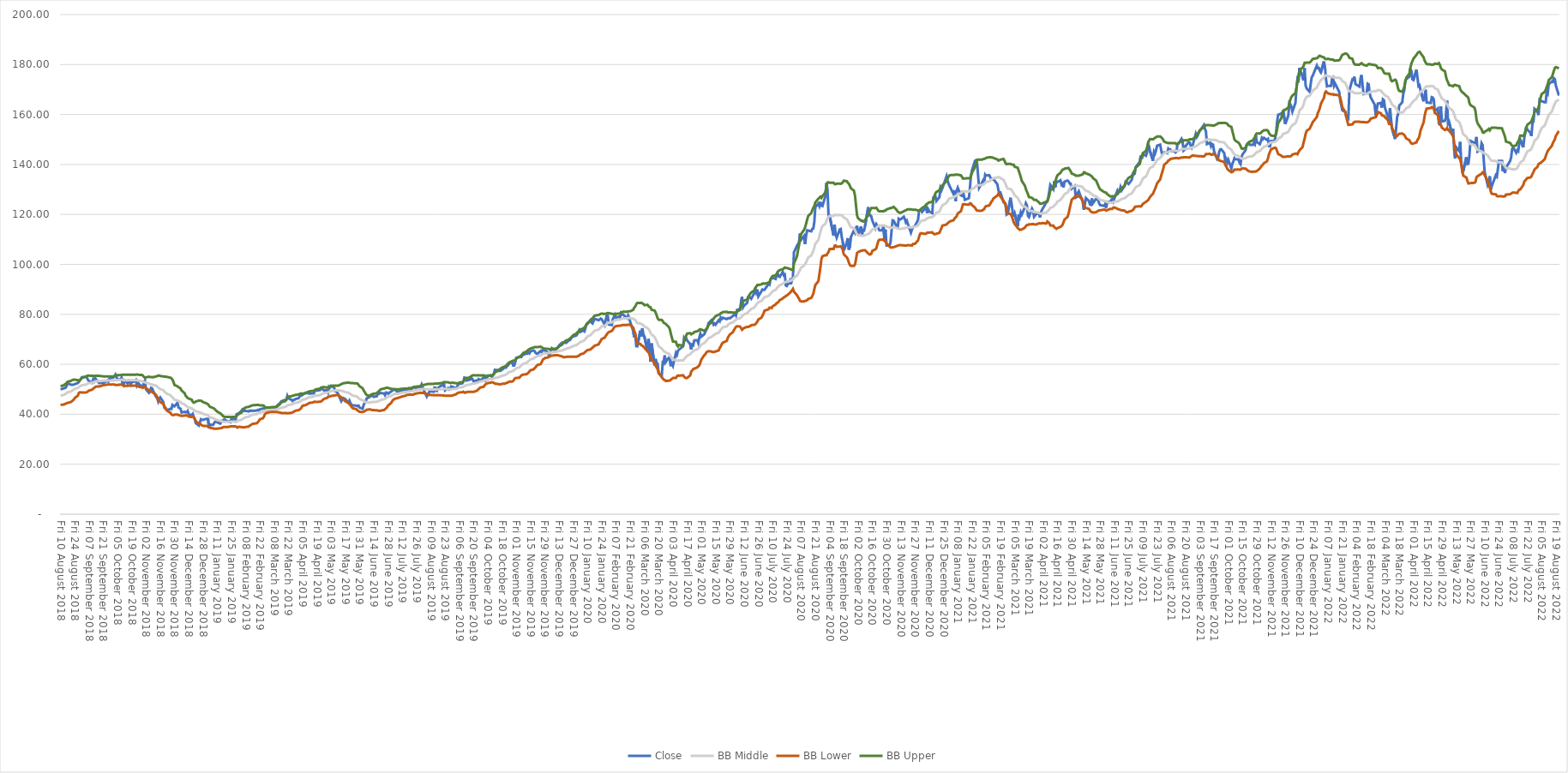
| Category | Close | BB Middle | BB Lower | BB Upper |
|---|---|---|---|---|
| 2022-08-22 | 167.57 | 165.946 | 153.407 | 178.484 |
| 2022-08-19 | 171.52 | 165.204 | 151.443 | 178.965 |
| 2022-08-18 | 174.15 | 164.322 | 150.041 | 178.603 |
| 2022-08-17 | 174.55 | 163.371 | 149.303 | 177.439 |
| 2022-08-16 | 173.03 | 162.285 | 148.486 | 176.084 |
| 2022-08-15 | 173.19 | 161.173 | 147.432 | 174.913 |
| 2022-08-12 | 172.1 | 159.857 | 145.931 | 173.783 |
| 2022-08-11 | 168.49 | 158.75 | 145.385 | 172.115 |
| 2022-08-10 | 169.24 | 157.739 | 144.414 | 171.064 |
| 2022-08-09 | 164.92 | 156.541 | 143.261 | 169.821 |
| 2022-08-08 | 164.87 | 155.578 | 142.076 | 169.08 |
| 2022-08-05 | 165.35 | 154.568 | 140.975 | 168.16 |
| 2022-08-04 | 165.58 | 153.642 | 140.603 | 166.682 |
| 2022-08-03 | 165.9 | 152.67 | 140.464 | 164.876 |
| 2022-08-02 | 159.788 | 151.512 | 140.18 | 162.843 |
| 2022-08-01 | 161.286 | 150.59 | 139.105 | 162.075 |
| 2022-07-29 | 162.285 | 149.463 | 137.972 | 160.954 |
| 2022-07-28 | 157.132 | 148.175 | 136.951 | 159.399 |
| 2022-07-27 | 156.573 | 147.27 | 136.163 | 158.377 |
| 2022-07-26 | 151.39 | 146.304 | 135.24 | 157.368 |
| 2022-07-25 | 152.738 | 145.808 | 134.811 | 156.805 |
| 2022-07-22 | 153.876 | 145.244 | 134.575 | 155.914 |
| 2022-07-21 | 155.135 | 144.454 | 134.124 | 154.784 |
| 2022-07-20 | 152.828 | 143.456 | 133.598 | 153.314 |
| 2022-07-19 | 150.791 | 142.598 | 133.177 | 152.02 |
| 2022-07-18 | 146.866 | 141.628 | 131.792 | 151.464 |
| 2022-07-15 | 149.962 | 140.778 | 130.009 | 151.548 |
| 2022-07-14 | 148.264 | 140.042 | 129.89 | 150.195 |
| 2022-07-13 | 145.288 | 139.258 | 129.346 | 149.17 |
| 2022-07-12 | 145.658 | 138.579 | 128.551 | 148.606 |
| 2022-07-11 | 144.669 | 138.143 | 128.639 | 147.646 |
| 2022-07-08 | 146.836 | 138.031 | 128.788 | 147.275 |
| 2022-07-07 | 146.147 | 138.077 | 128.652 | 147.503 |
| 2022-07-06 | 142.722 | 138.195 | 128.321 | 148.069 |
| 2022-07-05 | 141.364 | 138.356 | 128.095 | 148.617 |
| 2022-07-01 | 138.737 | 138.547 | 127.933 | 149.16 |
| 2022-06-30 | 136.53 | 139.16 | 127.237 | 151.082 |
| 2022-06-29 | 139.037 | 139.758 | 127.237 | 152.28 |
| 2022-06-28 | 137.249 | 140.238 | 127.141 | 153.335 |
| 2022-06-27 | 141.464 | 140.847 | 127.24 | 154.455 |
| 2022-06-24 | 141.464 | 140.953 | 127.295 | 154.611 |
| 2022-06-23 | 138.078 | 140.896 | 127.238 | 154.555 |
| 2022-06-22 | 135.162 | 141.001 | 127.398 | 154.603 |
| 2022-06-21 | 135.682 | 141.388 | 128.034 | 154.742 |
| 2022-06-17 | 131.378 | 141.474 | 128.246 | 154.702 |
| 2022-06-16 | 129.88 | 141.763 | 129.194 | 154.332 |
| 2022-06-15 | 135.242 | 142.3 | 130.95 | 153.651 |
| 2022-06-14 | 132.576 | 142.99 | 131.763 | 154.217 |
| 2022-06-13 | 131.697 | 143.628 | 133.439 | 153.817 |
| 2022-06-10 | 136.94 | 144.388 | 135.717 | 153.06 |
| 2022-06-09 | 142.442 | 144.66 | 136.621 | 152.698 |
| 2022-06-08 | 147.755 | 144.852 | 136.851 | 152.854 |
| 2022-06-07 | 148.504 | 145.179 | 136.249 | 154.109 |
| 2022-06-06 | 145.937 | 145.347 | 136.056 | 154.637 |
| 2022-06-03 | 145.178 | 145.903 | 135.298 | 156.508 |
| 2022-06-02 | 151 | 146.46 | 134.935 | 157.985 |
| 2022-06-01 | 148.504 | 147.187 | 133.065 | 161.31 |
| 2022-05-31 | 148.634 | 147.713 | 132.679 | 162.748 |
| 2022-05-27 | 149.432 | 148.157 | 132.528 | 163.786 |
| 2022-05-26 | 143.581 | 148.546 | 132.431 | 164.66 |
| 2022-05-25 | 140.325 | 149.525 | 132.387 | 166.663 |
| 2022-05-24 | 140.165 | 150.315 | 133.493 | 167.138 |
| 2022-05-23 | 142.911 | 151.125 | 134.783 | 167.467 |
| 2022-05-20 | 137.399 | 152.1 | 135.509 | 168.691 |
| 2022-05-19 | 137.159 | 153.296 | 137.697 | 168.896 |
| 2022-05-18 | 140.625 | 154.736 | 140.073 | 169.398 |
| 2022-05-17 | 149.033 | 156.042 | 141.999 | 170.085 |
| 2022-05-16 | 145.338 | 156.936 | 142.519 | 171.354 |
| 2022-05-13 | 146.906 | 157.899 | 144.152 | 171.647 |
| 2022-05-12 | 142.362 | 158.795 | 145.711 | 171.879 |
| 2022-05-11 | 146.297 | 160.173 | 148.583 | 171.762 |
| 2022-05-10 | 154.296 | 161.217 | 151.153 | 171.28 |
| 2022-05-09 | 151.849 | 161.766 | 152.082 | 171.45 |
| 2022-05-06 | 157.062 | 162.654 | 153.529 | 171.778 |
| 2022-05-05 | 156.323 | 163.383 | 153.841 | 172.925 |
| 2022-05-04 | 165.546 | 164.134 | 154.569 | 173.699 |
| 2022-05-03 | 159.025 | 164.585 | 154.001 | 175.169 |
| 2022-05-02 | 157.509 | 165.53 | 153.787 | 177.273 |
| 2022-04-29 | 157.2 | 166.345 | 154.679 | 178.011 |
| 2022-04-28 | 163.173 | 167.191 | 155.852 | 178.53 |
| 2022-04-27 | 156.123 | 167.895 | 155.91 | 179.88 |
| 2022-04-26 | 156.353 | 169.012 | 157.469 | 180.554 |
| 2022-04-25 | 162.415 | 169.949 | 159.698 | 180.199 |
| 2022-04-22 | 161.329 | 170.539 | 160.742 | 180.336 |
| 2022-04-21 | 165.945 | 171.151 | 162.243 | 180.059 |
| 2022-04-20 | 166.753 | 171.34 | 162.727 | 179.954 |
| 2022-04-19 | 166.923 | 171.42 | 162.948 | 179.891 |
| 2022-04-18 | 164.599 | 171.319 | 162.592 | 180.046 |
| 2022-04-14 | 164.819 | 171.265 | 162.359 | 180.17 |
| 2022-04-13 | 169.914 | 171.032 | 161.263 | 180.801 |
| 2022-04-12 | 167.182 | 170.493 | 159.433 | 181.553 |
| 2022-04-11 | 165.277 | 169.866 | 156.875 | 182.858 |
| 2022-04-08 | 169.605 | 169.112 | 153.629 | 184.595 |
| 2022-04-07 | 171.649 | 168.346 | 151.575 | 185.117 |
| 2022-04-06 | 171.34 | 167.667 | 150.394 | 184.94 |
| 2022-04-05 | 174.561 | 167.224 | 149.896 | 184.552 |
| 2022-04-04 | 177.931 | 166.346 | 148.814 | 183.877 |
| 2022-04-01 | 173.813 | 165.391 | 148.418 | 182.365 |
| 2022-03-31 | 174.112 | 164.836 | 148.279 | 181.393 |
| 2022-03-30 | 177.263 | 164.418 | 148.406 | 180.431 |
| 2022-03-29 | 178.45 | 163.859 | 148.936 | 178.783 |
| 2022-03-28 | 175.099 | 163.074 | 149.735 | 176.412 |
| 2022-03-25 | 174.222 | 162.551 | 150.369 | 174.733 |
| 2022-03-24 | 173.574 | 162.059 | 151.065 | 173.053 |
| 2022-03-23 | 169.725 | 161.494 | 151.847 | 171.142 |
| 2022-03-22 | 168.339 | 160.989 | 152.088 | 169.889 |
| 2022-03-21 | 164.908 | 160.764 | 152.407 | 169.121 |
| 2022-03-18 | 163.512 | 160.86 | 152.274 | 169.446 |
| 2022-03-17 | 160.162 | 161.104 | 151.97 | 170.238 |
| 2022-03-16 | 159.135 | 161.699 | 151.411 | 171.987 |
| 2022-03-15 | 154.648 | 162.357 | 151.165 | 173.549 |
| 2022-03-14 | 150.19 | 163.045 | 152.146 | 173.943 |
| 2022-03-11 | 154.289 | 163.943 | 154.576 | 173.31 |
| 2022-03-10 | 158.068 | 164.81 | 155.984 | 173.636 |
| 2022-03-09 | 162.485 | 165.696 | 156.223 | 175.168 |
| 2022-03-08 | 156.991 | 166.288 | 156.229 | 176.347 |
| 2022-03-07 | 158.846 | 166.997 | 157.688 | 176.305 |
| 2022-03-04 | 162.705 | 167.649 | 158.905 | 176.394 |
| 2022-03-03 | 165.756 | 168.124 | 159.475 | 176.772 |
| 2022-03-02 | 166.085 | 168.592 | 159.505 | 177.678 |
| 2022-03-01 | 162.735 | 168.982 | 159.691 | 178.273 |
| 2022-02-28 | 164.649 | 169.548 | 160.471 | 178.625 |
| 2022-02-25 | 164.38 | 169.797 | 161.003 | 178.591 |
| 2022-02-24 | 162.276 | 169.506 | 159.689 | 179.323 |
| 2022-02-23 | 159.613 | 169.344 | 158.964 | 179.724 |
| 2022-02-22 | 163.851 | 169.319 | 158.845 | 179.794 |
| 2022-02-18 | 166.823 | 169.175 | 158.328 | 180.021 |
| 2022-02-17 | 168.398 | 168.921 | 157.636 | 180.205 |
| 2022-02-16 | 172.058 | 168.692 | 157.192 | 180.192 |
| 2022-02-15 | 172.297 | 168.367 | 156.897 | 179.836 |
| 2022-02-14 | 168.398 | 168.207 | 156.873 | 179.541 |
| 2022-02-11 | 168.159 | 168.405 | 156.927 | 179.882 |
| 2022-02-10 | 171.629 | 168.571 | 157.016 | 180.125 |
| 2022-02-09 | 175.777 | 168.73 | 156.927 | 180.533 |
| 2022-02-08 | 174.331 | 168.659 | 157.01 | 180.307 |
| 2022-02-07 | 171.17 | 168.516 | 157.081 | 179.952 |
| 2022-02-04 | 171.898 | 168.531 | 157.081 | 179.98 |
| 2022-02-03 | 172.187 | 168.5 | 157.083 | 179.917 |
| 2022-02-02 | 175.115 | 168.601 | 157.021 | 180.18 |
| 2022-02-01 | 173.89 | 168.793 | 156.673 | 180.914 |
| 2022-01-31 | 174.06 | 169.162 | 156.037 | 182.286 |
| 2022-01-28 | 169.628 | 169.3 | 155.915 | 182.686 |
| 2022-01-27 | 158.564 | 169.692 | 155.841 | 183.544 |
| 2022-01-26 | 159.032 | 170.696 | 157.314 | 184.078 |
| 2022-01-25 | 159.122 | 171.672 | 159.007 | 184.337 |
| 2022-01-24 | 160.954 | 172.695 | 160.981 | 184.41 |
| 2022-01-21 | 161.741 | 173.425 | 162.977 | 183.873 |
| 2022-01-20 | 163.832 | 174.084 | 165.108 | 183.06 |
| 2022-01-19 | 165.545 | 174.506 | 166.794 | 182.219 |
| 2022-01-18 | 169.1 | 174.682 | 167.664 | 181.7 |
| 2022-01-14 | 172.357 | 174.748 | 167.921 | 181.576 |
| 2022-01-13 | 171.48 | 174.708 | 167.815 | 181.601 |
| 2022-01-12 | 174.807 | 175.062 | 168.142 | 181.983 |
| 2022-01-11 | 174.358 | 175.002 | 168.054 | 181.951 |
| 2022-01-10 | 171.48 | 175.035 | 168.093 | 181.978 |
| 2022-01-07 | 171.46 | 175.397 | 168.479 | 182.314 |
| 2022-01-06 | 171.291 | 175.516 | 168.794 | 182.237 |
| 2022-01-05 | 174.199 | 175.669 | 169.205 | 182.133 |
| 2022-01-04 | 178.959 | 175.483 | 168.656 | 182.31 |
| 2022-01-03 | 181.26 | 174.767 | 166.664 | 182.87 |
| 2021-12-31 | 176.838 | 173.762 | 164.268 | 183.257 |
| 2021-12-30 | 177.466 | 173.075 | 162.626 | 183.523 |
| 2021-12-29 | 178.641 | 172.406 | 161.467 | 183.345 |
| 2021-12-28 | 178.551 | 171.705 | 160.657 | 182.753 |
| 2021-12-27 | 179.587 | 170.756 | 158.988 | 182.524 |
| 2021-12-23 | 175.554 | 169.585 | 156.936 | 182.234 |
| 2021-12-22 | 174.916 | 168.871 | 156.04 | 181.703 |
| 2021-12-21 | 172.277 | 168.163 | 155.18 | 181.145 |
| 2021-12-20 | 169.05 | 167.567 | 154.303 | 180.83 |
| 2021-12-17 | 170.435 | 167.108 | 153.455 | 180.762 |
| 2021-12-16 | 171.55 | 166.448 | 152.234 | 180.661 |
| 2021-12-15 | 178.561 | 165.513 | 150.338 | 180.688 |
| 2021-12-14 | 173.612 | 164.104 | 148.804 | 179.404 |
| 2021-12-13 | 175.016 | 162.892 | 146.971 | 178.814 |
| 2021-12-10 | 178.71 | 161.61 | 145.67 | 177.55 |
| 2021-12-09 | 173.841 | 160.038 | 144.975 | 175.101 |
| 2021-12-08 | 174.358 | 158.711 | 144.078 | 173.345 |
| 2021-12-07 | 170.475 | 157.503 | 144.317 | 170.688 |
| 2021-12-06 | 164.639 | 156.47 | 144.315 | 168.625 |
| 2021-12-03 | 161.173 | 155.771 | 143.972 | 167.569 |
| 2021-12-02 | 163.085 | 155.218 | 143.448 | 166.988 |
| 2021-12-01 | 164.091 | 154.596 | 143.248 | 165.945 |
| 2021-11-30 | 164.619 | 153.851 | 143.155 | 164.547 |
| 2021-11-29 | 159.58 | 153.026 | 143.278 | 162.775 |
| 2021-11-26 | 156.164 | 152.496 | 143.082 | 161.909 |
| 2021-11-24 | 161.273 | 152.274 | 143.008 | 161.539 |
| 2021-11-23 | 160.745 | 151.611 | 143.154 | 160.067 |
| 2021-11-22 | 160.356 | 150.998 | 143.563 | 158.433 |
| 2021-11-19 | 159.888 | 150.371 | 144.189 | 156.553 |
| 2021-11-18 | 157.219 | 149.769 | 145.307 | 154.232 |
| 2021-11-17 | 152.857 | 149.341 | 146.455 | 152.227 |
| 2021-11-16 | 150.378 | 149.119 | 146.705 | 151.533 |
| 2021-11-15 | 149.382 | 148.997 | 146.603 | 151.392 |
| 2021-11-12 | 149.372 | 148.815 | 146.04 | 151.59 |
| 2021-11-11 | 147.261 | 148.548 | 145.094 | 152.001 |
| 2021-11-10 | 147.31 | 148.333 | 144.131 | 152.535 |
| 2021-11-09 | 150.188 | 147.973 | 142.459 | 153.488 |
| 2021-11-08 | 149.82 | 147.5 | 141.251 | 153.749 |
| 2021-11-05 | 150.657 | 147.11 | 140.523 | 153.696 |
| 2021-11-04 | 150.119 | 146.682 | 139.963 | 153.401 |
| 2021-11-03 | 150.646 | 146.301 | 139.54 | 153.062 |
| 2021-11-02 | 149.184 | 145.829 | 139.03 | 152.628 |
| 2021-11-01 | 148.13 | 145.386 | 138.368 | 152.404 |
| 2021-10-29 | 148.965 | 144.898 | 137.371 | 152.425 |
| 2021-10-28 | 151.72 | 144.542 | 137.147 | 151.937 |
| 2021-10-27 | 148.021 | 143.992 | 137.201 | 150.782 |
| 2021-10-26 | 148.488 | 143.692 | 137.114 | 150.27 |
| 2021-10-25 | 147.812 | 143.324 | 137.043 | 149.605 |
| 2021-10-22 | 147.861 | 143.161 | 137.193 | 149.13 |
| 2021-10-21 | 148.647 | 143.073 | 137.337 | 148.81 |
| 2021-10-20 | 148.428 | 142.942 | 137.617 | 148.266 |
| 2021-10-19 | 147.931 | 142.772 | 137.967 | 147.577 |
| 2021-10-18 | 145.733 | 142.507 | 138.325 | 146.689 |
| 2021-10-15 | 144.033 | 142.327 | 138.415 | 146.24 |
| 2021-10-14 | 142.959 | 142.388 | 138.337 | 146.44 |
| 2021-10-13 | 140.125 | 142.638 | 137.915 | 147.362 |
| 2021-10-12 | 140.721 | 143.042 | 137.886 | 148.198 |
| 2021-10-11 | 142.014 | 143.371 | 138.014 | 148.727 |
| 2021-10-08 | 142.104 | 143.706 | 137.91 | 149.501 |
| 2021-10-07 | 142.492 | 144.008 | 137.954 | 150.061 |
| 2021-10-06 | 141.209 | 144.544 | 137.334 | 151.753 |
| 2021-10-05 | 140.324 | 145.195 | 137.018 | 153.373 |
| 2021-10-04 | 138.365 | 145.97 | 136.898 | 155.042 |
| 2021-10-01 | 141.855 | 146.724 | 137.801 | 155.646 |
| 2021-09-30 | 140.712 | 147.271 | 138.268 | 156.273 |
| 2021-09-29 | 142.034 | 147.818 | 139.152 | 156.484 |
| 2021-09-28 | 141.119 | 148.266 | 139.923 | 156.609 |
| 2021-09-27 | 144.56 | 148.823 | 140.99 | 156.656 |
| 2021-09-24 | 146.101 | 148.984 | 141.379 | 156.589 |
| 2021-09-23 | 146.012 | 149.014 | 141.452 | 156.577 |
| 2021-09-22 | 145.037 | 149.091 | 141.62 | 156.561 |
| 2021-09-21 | 142.631 | 149.278 | 142.039 | 156.517 |
| 2021-09-20 | 142.143 | 149.59 | 143.017 | 156.163 |
| 2021-09-17 | 145.246 | 149.851 | 144.121 | 155.581 |
| 2021-09-16 | 147.961 | 149.883 | 144.249 | 155.517 |
| 2021-09-15 | 148.2 | 149.762 | 143.871 | 155.653 |
| 2021-09-14 | 147.295 | 149.82 | 143.969 | 155.671 |
| 2021-09-13 | 148.717 | 149.969 | 144.232 | 155.706 |
| 2021-09-10 | 148.14 | 149.947 | 144.187 | 155.707 |
| 2021-09-09 | 153.211 | 149.943 | 144.178 | 155.708 |
| 2021-09-08 | 154.246 | 149.535 | 143.599 | 155.47 |
| 2021-09-07 | 155.817 | 149.062 | 143.197 | 154.927 |
| 2021-09-03 | 153.44 | 148.535 | 143.336 | 153.733 |
| 2021-09-02 | 152.794 | 148.129 | 143.27 | 152.988 |
| 2021-09-01 | 151.66 | 147.79 | 143.353 | 152.228 |
| 2021-08-31 | 150.984 | 147.503 | 143.371 | 151.635 |
| 2021-08-30 | 152.267 | 147.27 | 143.434 | 151.105 |
| 2021-08-27 | 147.772 | 146.881 | 143.617 | 150.145 |
| 2021-08-26 | 146.718 | 146.734 | 143.38 | 150.088 |
| 2021-08-25 | 147.533 | 146.629 | 143.149 | 150.108 |
| 2021-08-24 | 148.786 | 146.45 | 142.811 | 150.089 |
| 2021-08-23 | 148.876 | 146.297 | 142.81 | 149.784 |
| 2021-08-20 | 147.364 | 146.25 | 142.88 | 149.621 |
| 2021-08-19 | 145.883 | 146.258 | 142.877 | 149.638 |
| 2021-08-18 | 145.544 | 146.252 | 142.868 | 149.636 |
| 2021-08-17 | 149.353 | 146.193 | 142.723 | 149.663 |
| 2021-08-16 | 150.278 | 145.981 | 142.804 | 149.159 |
| 2021-08-13 | 148.269 | 145.54 | 142.419 | 148.661 |
| 2021-08-12 | 148.06 | 145.394 | 142.535 | 148.253 |
| 2021-08-11 | 145.047 | 145.363 | 142.61 | 148.116 |
| 2021-08-10 | 144.789 | 145.515 | 142.522 | 148.509 |
| 2021-08-09 | 145.276 | 145.506 | 142.503 | 148.509 |
| 2021-08-06 | 145.326 | 145.417 | 142.287 | 148.546 |
| 2021-08-05 | 146.022 | 145.354 | 142.171 | 148.538 |
| 2021-08-04 | 145.913 | 145.165 | 141.722 | 148.608 |
| 2021-08-03 | 146.32 | 145.047 | 141.552 | 148.541 |
| 2021-08-02 | 144.493 | 144.782 | 140.928 | 148.635 |
| 2021-07-30 | 144.83 | 144.506 | 139.892 | 149.119 |
| 2021-07-29 | 144.612 | 144.079 | 138.249 | 149.91 |
| 2021-07-28 | 143.956 | 143.648 | 136.846 | 150.45 |
| 2021-07-27 | 145.734 | 143.219 | 135.523 | 150.915 |
| 2021-07-26 | 147.938 | 142.623 | 134.011 | 151.236 |
| 2021-07-23 | 147.511 | 141.835 | 132.46 | 151.211 |
| 2021-07-22 | 145.764 | 141.083 | 131.247 | 150.919 |
| 2021-07-21 | 144.373 | 140.432 | 130.208 | 150.657 |
| 2021-07-20 | 145.118 | 139.866 | 129.326 | 150.405 |
| 2021-07-19 | 141.444 | 139.178 | 128.309 | 150.047 |
| 2021-07-16 | 145.356 | 138.583 | 126.995 | 150.17 |
| 2021-07-15 | 147.432 | 137.858 | 126.242 | 149.473 |
| 2021-07-14 | 148.097 | 136.948 | 125.627 | 148.268 |
| 2021-07-13 | 144.612 | 135.979 | 125.346 | 146.612 |
| 2021-07-12 | 143.48 | 135.227 | 125.022 | 145.431 |
| 2021-07-09 | 144.086 | 134.375 | 124.225 | 144.525 |
| 2021-07-08 | 142.229 | 133.432 | 123.564 | 143.299 |
| 2021-07-07 | 143.549 | 132.632 | 123.161 | 142.103 |
| 2021-07-06 | 141.017 | 131.747 | 123.265 | 140.228 |
| 2021-07-02 | 138.972 | 130.946 | 123.12 | 138.773 |
| 2021-07-01 | 136.301 | 130.248 | 122.934 | 137.562 |
| 2021-06-30 | 135.993 | 129.566 | 122.096 | 137.036 |
| 2021-06-29 | 135.367 | 128.975 | 121.768 | 136.183 |
| 2021-06-28 | 133.828 | 128.377 | 121.409 | 135.346 |
| 2021-06-25 | 132.17 | 127.872 | 121.096 | 134.648 |
| 2021-06-24 | 132.468 | 127.484 | 120.848 | 134.119 |
| 2021-06-23 | 132.756 | 127.158 | 120.904 | 133.412 |
| 2021-06-22 | 133.034 | 126.82 | 121.106 | 132.534 |
| 2021-06-21 | 131.366 | 126.479 | 121.525 | 131.432 |
| 2021-06-18 | 129.539 | 126.138 | 121.661 | 130.615 |
| 2021-06-17 | 130.86 | 125.981 | 121.78 | 130.182 |
| 2021-06-16 | 129.231 | 125.629 | 121.977 | 129.28 |
| 2021-06-15 | 128.725 | 125.366 | 122.047 | 128.684 |
| 2021-06-14 | 129.559 | 125.198 | 122.258 | 128.138 |
| 2021-06-11 | 126.451 | 125.048 | 122.786 | 127.31 |
| 2021-06-10 | 125.22 | 124.93 | 122.727 | 127.132 |
| 2021-06-09 | 126.232 | 124.764 | 122.204 | 127.324 |
| 2021-06-08 | 125.845 | 124.703 | 122.229 | 127.178 |
| 2021-06-07 | 125.011 | 124.709 | 122.224 | 127.194 |
| 2021-06-04 | 125.001 | 124.923 | 121.733 | 128.112 |
| 2021-06-03 | 122.668 | 125.103 | 121.532 | 128.674 |
| 2021-06-02 | 124.177 | 125.319 | 121.842 | 128.795 |
| 2021-06-01 | 123.403 | 125.446 | 121.959 | 128.933 |
| 2021-05-28 | 123.73 | 125.845 | 121.634 | 130.056 |
| 2021-05-27 | 124.396 | 126.174 | 121.658 | 130.69 |
| 2021-05-26 | 125.954 | 126.57 | 121.406 | 131.734 |
| 2021-05-25 | 126.004 | 126.893 | 121.148 | 132.638 |
| 2021-05-24 | 126.203 | 127.254 | 120.904 | 133.603 |
| 2021-05-21 | 124.544 | 127.621 | 120.731 | 134.51 |
| 2021-05-20 | 126.411 | 128.051 | 120.913 | 135.188 |
| 2021-05-19 | 123.81 | 128.269 | 121.079 | 135.46 |
| 2021-05-18 | 123.969 | 128.696 | 121.603 | 135.788 |
| 2021-05-17 | 125.379 | 129.094 | 122.216 | 135.973 |
| 2021-05-14 | 126.55 | 129.509 | 122.578 | 136.439 |
| 2021-05-13 | 124.088 | 129.83 | 122.881 | 136.78 |
| 2021-05-12 | 121.903 | 130.292 | 123.713 | 136.871 |
| 2021-05-11 | 125.021 | 130.741 | 125.405 | 136.077 |
| 2021-05-10 | 125.954 | 131.152 | 126.407 | 135.898 |
| 2021-05-07 | 129.291 | 131.359 | 127.216 | 135.502 |
| 2021-05-06 | 128.606 | 131.487 | 127.451 | 135.523 |
| 2021-05-05 | 126.98 | 131.517 | 127.561 | 135.474 |
| 2021-05-04 | 126.732 | 131.507 | 127.505 | 135.51 |
| 2021-05-03 | 131.381 | 131.426 | 126.996 | 135.857 |
| 2021-04-30 | 130.311 | 131.097 | 125.808 | 136.387 |
| 2021-04-29 | 132.313 | 130.678 | 124.046 | 137.309 |
| 2021-04-28 | 132.412 | 130.116 | 122.332 | 137.901 |
| 2021-04-27 | 133.215 | 129.438 | 120.323 | 138.553 |
| 2021-04-26 | 133.542 | 128.794 | 119.039 | 138.549 |
| 2021-04-23 | 133.146 | 128.124 | 117.936 | 138.313 |
| 2021-04-22 | 130.786 | 127.444 | 116.877 | 138.011 |
| 2021-04-21 | 132.333 | 126.857 | 115.803 | 137.91 |
| 2021-04-20 | 131.946 | 126.313 | 115.322 | 137.304 |
| 2021-04-19 | 133.661 | 125.832 | 115.027 | 136.636 |
| 2021-04-16 | 132.987 | 125.096 | 114.522 | 135.669 |
| 2021-04-15 | 133.324 | 124.42 | 114.23 | 134.61 |
| 2021-04-14 | 130.876 | 123.937 | 114.601 | 133.273 |
| 2021-04-13 | 133.255 | 123.617 | 114.832 | 132.403 |
| 2021-04-12 | 130.092 | 123.1 | 115.508 | 130.692 |
| 2021-04-09 | 131.837 | 122.594 | 115.609 | 129.579 |
| 2021-04-08 | 129.22 | 122.046 | 116.471 | 127.622 |
| 2021-04-07 | 126.782 | 121.532 | 116.877 | 126.187 |
| 2021-04-06 | 125.106 | 121.194 | 117.175 | 125.214 |
| 2021-04-05 | 124.799 | 120.706 | 116.348 | 125.064 |
| 2021-04-01 | 121.925 | 120.484 | 116.551 | 124.417 |
| 2021-03-31 | 121.082 | 120.342 | 116.422 | 124.262 |
| 2021-03-30 | 118.852 | 120.338 | 116.421 | 124.254 |
| 2021-03-29 | 120.329 | 120.596 | 116.431 | 124.762 |
| 2021-03-26 | 120.15 | 120.913 | 115.982 | 125.845 |
| 2021-03-25 | 119.536 | 120.916 | 115.986 | 125.846 |
| 2021-03-24 | 119.04 | 120.936 | 116.025 | 125.847 |
| 2021-03-23 | 121.469 | 121.196 | 116.164 | 126.229 |
| 2021-03-22 | 122.311 | 121.361 | 116.094 | 126.628 |
| 2021-03-19 | 118.941 | 121.49 | 116.013 | 126.967 |
| 2021-03-18 | 119.476 | 121.98 | 115.797 | 128.163 |
| 2021-03-17 | 123.669 | 122.435 | 115.738 | 129.132 |
| 2021-03-16 | 124.472 | 122.736 | 115.338 | 130.134 |
| 2021-03-15 | 122.906 | 123.114 | 114.699 | 131.529 |
| 2021-03-12 | 119.972 | 123.678 | 113.98 | 133.376 |
| 2021-03-11 | 120.894 | 124.377 | 113.867 | 134.886 |
| 2021-03-10 | 118.931 | 125.043 | 113.837 | 136.248 |
| 2021-03-09 | 120.031 | 125.837 | 114.231 | 137.443 |
| 2021-03-08 | 115.343 | 126.621 | 114.579 | 138.663 |
| 2021-03-05 | 120.358 | 127.632 | 116.166 | 139.098 |
| 2021-03-04 | 119.08 | 128.414 | 116.907 | 139.92 |
| 2021-03-03 | 120.993 | 129.088 | 118.289 | 139.887 |
| 2021-03-02 | 124.026 | 129.719 | 119.423 | 140.015 |
| 2021-03-01 | 126.673 | 130.156 | 120.125 | 140.187 |
| 2021-02-26 | 120.2 | 130.353 | 120.449 | 140.257 |
| 2021-02-25 | 119.932 | 131.127 | 122.141 | 140.114 |
| 2021-02-24 | 124.254 | 132.161 | 123.831 | 140.491 |
| 2021-02-23 | 124.76 | 133.033 | 124.547 | 141.52 |
| 2021-02-22 | 124.898 | 133.868 | 125.517 | 142.22 |
| 2021-02-19 | 128.734 | 134.506 | 127.097 | 141.914 |
| 2021-02-18 | 128.576 | 134.843 | 127.918 | 141.768 |
| 2021-02-17 | 129.696 | 134.948 | 128.351 | 141.545 |
| 2021-02-16 | 132.025 | 134.789 | 127.571 | 142.007 |
| 2021-02-12 | 134.186 | 134.48 | 126.343 | 142.617 |
| 2021-02-11 | 133.948 | 134.15 | 125.476 | 142.824 |
| 2021-02-10 | 134.206 | 133.93 | 125.027 | 142.834 |
| 2021-02-09 | 134.821 | 133.594 | 124.261 | 142.928 |
| 2021-02-08 | 135.713 | 133.236 | 123.575 | 142.898 |
| 2021-02-05 | 135.564 | 132.986 | 123.334 | 142.637 |
| 2021-02-04 | 135.986 | 132.687 | 123.003 | 142.371 |
| 2021-02-03 | 132.571 | 132.153 | 122.085 | 142.22 |
| 2021-02-02 | 133.61 | 132.008 | 121.885 | 142.13 |
| 2021-02-01 | 132.769 | 131.731 | 121.498 | 141.965 |
| 2021-01-29 | 130.611 | 131.66 | 121.436 | 141.883 |
| 2021-01-28 | 135.689 | 131.747 | 121.531 | 141.963 |
| 2021-01-27 | 140.608 | 131.637 | 121.546 | 141.728 |
| 2021-01-26 | 141.697 | 131.371 | 121.984 | 140.758 |
| 2021-01-25 | 141.459 | 130.817 | 122.713 | 138.922 |
| 2021-01-22 | 137.648 | 130.225 | 123.751 | 136.7 |
| 2021-01-21 | 135.471 | 129.87 | 124.355 | 135.384 |
| 2021-01-20 | 130.68 | 129.442 | 124.428 | 134.456 |
| 2021-01-19 | 126.523 | 129.176 | 123.896 | 134.456 |
| 2021-01-15 | 125.84 | 129.219 | 124.013 | 134.426 |
| 2021-01-14 | 127.592 | 129.253 | 124.125 | 134.38 |
| 2021-01-13 | 129.552 | 129.202 | 123.989 | 134.414 |
| 2021-01-12 | 127.483 | 128.751 | 122.32 | 135.181 |
| 2021-01-11 | 127.661 | 128.434 | 121.212 | 135.657 |
| 2021-01-08 | 130.7 | 128.15 | 120.401 | 135.899 |
| 2021-01-07 | 129.582 | 127.642 | 119.317 | 135.968 |
| 2021-01-06 | 125.306 | 127.319 | 118.818 | 135.819 |
| 2021-01-05 | 129.671 | 127.177 | 118.458 | 135.897 |
| 2021-01-04 | 128.087 | 126.744 | 117.707 | 135.781 |
| 2020-12-31 | 131.334 | 126.424 | 117.149 | 135.699 |
| 2020-12-30 | 132.353 | 125.948 | 116.754 | 135.142 |
| 2020-12-29 | 133.491 | 125.404 | 116.506 | 134.301 |
| 2020-12-28 | 135.293 | 124.621 | 115.955 | 133.286 |
| 2020-12-24 | 130.621 | 123.626 | 115.541 | 131.711 |
| 2020-12-23 | 129.621 | 122.837 | 114.56 | 131.115 |
| 2020-12-22 | 130.532 | 122.056 | 113.54 | 130.572 |
| 2020-12-21 | 126.919 | 121.164 | 112.647 | 129.68 |
| 2020-12-18 | 125.365 | 120.625 | 112.271 | 128.978 |
| 2020-12-17 | 127.384 | 120.228 | 112.061 | 128.395 |
| 2020-12-16 | 126.503 | 119.7 | 112.106 | 127.293 |
| 2020-12-15 | 126.573 | 119.283 | 112.342 | 126.224 |
| 2020-12-14 | 120.535 | 118.908 | 112.825 | 124.99 |
| 2020-12-11 | 121.159 | 118.783 | 112.737 | 124.829 |
| 2020-12-10 | 121.98 | 118.625 | 112.671 | 124.579 |
| 2020-12-09 | 120.535 | 118.439 | 112.687 | 124.191 |
| 2020-12-08 | 123.108 | 118.152 | 112.274 | 124.03 |
| 2020-12-07 | 122.485 | 117.753 | 112.201 | 123.305 |
| 2020-12-04 | 121 | 117.502 | 112.393 | 122.612 |
| 2020-12-03 | 121.683 | 117.333 | 112.48 | 122.186 |
| 2020-12-02 | 121.822 | 116.928 | 112.245 | 121.61 |
| 2020-12-01 | 121.465 | 116.293 | 111.029 | 121.556 |
| 2020-11-30 | 117.833 | 115.593 | 109.597 | 121.589 |
| 2020-11-27 | 115.398 | 115.08 | 108.239 | 121.921 |
| 2020-11-25 | 114.844 | 115.007 | 108.15 | 121.864 |
| 2020-11-24 | 113.993 | 114.758 | 107.545 | 121.972 |
| 2020-11-23 | 112.686 | 114.819 | 107.612 | 122.026 |
| 2020-11-20 | 116.14 | 114.869 | 107.708 | 122.03 |
| 2020-11-19 | 117.427 | 114.745 | 107.591 | 121.9 |
| 2020-11-18 | 116.823 | 114.592 | 107.544 | 121.641 |
| 2020-11-17 | 118.17 | 114.525 | 107.537 | 121.512 |
| 2020-11-16 | 119.07 | 114.422 | 107.593 | 121.25 |
| 2020-11-13 | 118.041 | 114.198 | 107.709 | 120.687 |
| 2020-11-12 | 117.991 | 114.176 | 107.736 | 120.616 |
| 2020-11-11 | 118.268 | 114.24 | 107.627 | 120.853 |
| 2020-11-10 | 114.784 | 114.314 | 107.493 | 121.135 |
| 2020-11-09 | 115.131 | 114.557 | 107.35 | 121.765 |
| 2020-11-06 | 117.477 | 114.947 | 106.869 | 123.025 |
| 2020-11-05 | 117.61 | 114.852 | 106.851 | 122.853 |
| 2020-11-04 | 113.579 | 114.651 | 106.736 | 122.566 |
| 2020-11-03 | 109.123 | 114.657 | 106.746 | 122.569 |
| 2020-11-02 | 107.473 | 114.792 | 107.175 | 122.409 |
| 2020-10-30 | 107.562 | 115.174 | 108.337 | 122.01 |
| 2020-10-29 | 113.945 | 115.379 | 109.261 | 121.498 |
| 2020-10-28 | 109.874 | 115.452 | 109.369 | 121.535 |
| 2020-10-27 | 115.209 | 115.68 | 110.132 | 121.228 |
| 2020-10-26 | 113.678 | 115.556 | 109.862 | 121.249 |
| 2020-10-23 | 113.668 | 115.551 | 109.852 | 121.251 |
| 2020-10-22 | 114.369 | 115.415 | 109.419 | 121.411 |
| 2020-10-21 | 115.476 | 115.043 | 108.001 | 122.084 |
| 2020-10-20 | 116.108 | 114.561 | 106.465 | 122.657 |
| 2020-10-19 | 114.597 | 114.279 | 106.028 | 122.531 |
| 2020-10-16 | 117.6 | 113.988 | 105.397 | 122.579 |
| 2020-10-15 | 119.27 | 113.386 | 104.225 | 122.548 |
| 2020-10-14 | 119.745 | 112.874 | 103.943 | 121.805 |
| 2020-10-13 | 119.656 | 112.426 | 104.037 | 120.816 |
| 2020-10-12 | 122.916 | 112.152 | 104.39 | 119.913 |
| 2020-10-09 | 115.575 | 111.705 | 105.628 | 117.782 |
| 2020-10-08 | 113.599 | 111.46 | 105.636 | 117.283 |
| 2020-10-07 | 113.707 | 111.386 | 105.636 | 117.137 |
| 2020-10-06 | 111.81 | 111.497 | 105.492 | 117.502 |
| 2020-10-05 | 115.11 | 111.48 | 105.477 | 117.483 |
| 2020-10-02 | 111.672 | 111.701 | 104.909 | 118.492 |
| 2020-10-01 | 115.397 | 112.089 | 104.506 | 119.671 |
| 2020-09-30 | 114.429 | 112.811 | 102.032 | 123.59 |
| 2020-09-29 | 112.729 | 113.718 | 99.915 | 127.522 |
| 2020-09-28 | 113.589 | 114.457 | 99.419 | 129.495 |
| 2020-09-25 | 110.941 | 114.943 | 99.427 | 130.46 |
| 2020-09-24 | 106.929 | 115.572 | 99.739 | 131.405 |
| 2020-09-23 | 105.842 | 116.476 | 100.656 | 132.297 |
| 2020-09-22 | 110.476 | 117.351 | 102.053 | 132.649 |
| 2020-09-21 | 108.767 | 118.045 | 102.798 | 133.292 |
| 2020-09-18 | 105.566 | 118.751 | 103.988 | 133.514 |
| 2020-09-17 | 109.024 | 119.316 | 105.803 | 132.829 |
| 2020-09-16 | 110.793 | 119.581 | 106.693 | 132.47 |
| 2020-09-15 | 114.162 | 119.751 | 107.246 | 132.256 |
| 2020-09-14 | 113.984 | 119.705 | 107.111 | 132.298 |
| 2020-09-11 | 110.664 | 119.682 | 107.047 | 132.318 |
| 2020-09-10 | 112.136 | 119.831 | 107.559 | 132.104 |
| 2020-09-09 | 115.921 | 119.807 | 107.474 | 132.141 |
| 2020-09-08 | 111.474 | 119.415 | 106.147 | 132.683 |
| 2020-09-04 | 119.517 | 119.41 | 106.132 | 132.689 |
| 2020-09-03 | 119.438 | 118.924 | 104.999 | 132.848 |
| 2020-09-02 | 129.833 | 118.569 | 104.356 | 132.782 |
| 2020-09-01 | 132.58 | 117.505 | 103.643 | 131.367 |
| 2020-08-31 | 127.501 | 116.284 | 103.706 | 128.862 |
| 2020-08-28 | 123.319 | 115.281 | 103.254 | 127.308 |
| 2020-08-27 | 123.519 | 114.356 | 102.098 | 126.614 |
| 2020-08-26 | 125.013 | 112.923 | 98.739 | 127.107 |
| 2020-08-25 | 123.336 | 111.359 | 96.004 | 126.715 |
| 2020-08-24 | 124.356 | 109.791 | 93.286 | 126.296 |
| 2020-08-21 | 122.887 | 108.249 | 91.712 | 124.786 |
| 2020-08-20 | 116.864 | 106.672 | 90.004 | 123.34 |
| 2020-08-19 | 114.327 | 105.407 | 88.195 | 122.619 |
| 2020-08-18 | 114.184 | 104.488 | 87.316 | 121.66 |
| 2020-08-17 | 113.241 | 103.562 | 86.586 | 120.539 |
| 2020-08-14 | 113.537 | 102.751 | 86.155 | 119.347 |
| 2020-08-13 | 113.638 | 101.824 | 85.677 | 117.971 |
| 2020-08-12 | 111.662 | 100.902 | 85.469 | 116.336 |
| 2020-08-11 | 108.07 | 100.138 | 85.415 | 114.862 |
| 2020-08-10 | 111.383 | 99.521 | 85.149 | 113.894 |
| 2020-08-07 | 109.787 | 98.661 | 85.2 | 112.121 |
| 2020-08-06 | 112.341 | 97.902 | 85.355 | 110.448 |
| 2020-08-05 | 108.554 | 97.006 | 86.287 | 107.726 |
| 2020-08-04 | 108.162 | 96.281 | 86.906 | 105.656 |
| 2020-08-03 | 107.444 | 95.467 | 87.666 | 103.268 |
| 2020-07-31 | 104.804 | 94.704 | 89.048 | 100.361 |
| 2020-07-30 | 94.872 | 93.953 | 90.186 | 97.72 |
| 2020-07-29 | 93.737 | 93.698 | 89.546 | 97.851 |
| 2020-07-28 | 91.974 | 93.509 | 89.047 | 97.971 |
| 2020-07-27 | 93.511 | 93.371 | 88.568 | 98.173 |
| 2020-07-24 | 91.346 | 93.055 | 87.551 | 98.558 |
| 2020-07-23 | 91.572 | 92.985 | 87.364 | 98.607 |
| 2020-07-22 | 95.939 | 92.846 | 86.959 | 98.733 |
| 2020-07-21 | 95.671 | 92.568 | 86.767 | 98.369 |
| 2020-07-20 | 97.009 | 92.209 | 86.331 | 98.086 |
| 2020-07-17 | 95.007 | 91.67 | 85.677 | 97.663 |
| 2020-07-16 | 95.2 | 91.256 | 85.1 | 97.411 |
| 2020-07-15 | 96.386 | 90.83 | 84.648 | 97.012 |
| 2020-07-14 | 95.727 | 90.352 | 84.49 | 96.213 |
| 2020-07-13 | 94.169 | 89.794 | 83.962 | 95.626 |
| 2020-07-10 | 94.605 | 89.263 | 83.19 | 95.336 |
| 2020-07-09 | 94.44 | 88.674 | 82.503 | 94.844 |
| 2020-07-08 | 94.036 | 88.302 | 82.695 | 93.908 |
| 2020-07-07 | 91.896 | 87.841 | 82.7 | 92.982 |
| 2020-07-06 | 92.182 | 87.357 | 82.017 | 92.697 |
| 2020-07-02 | 89.78 | 86.835 | 81.442 | 92.228 |
| 2020-07-01 | 89.78 | 86.32 | 80.227 | 92.412 |
| 2020-06-30 | 89.95 | 85.839 | 79.407 | 92.271 |
| 2020-06-29 | 89.205 | 85.328 | 78.663 | 91.993 |
| 2020-06-26 | 87.196 | 84.836 | 77.939 | 91.733 |
| 2020-06-25 | 89.96 | 84.396 | 77.049 | 91.742 |
| 2020-06-24 | 88.781 | 83.821 | 76.508 | 91.134 |
| 2020-06-23 | 90.377 | 83.304 | 76.004 | 90.604 |
| 2020-06-22 | 88.488 | 82.69 | 75.82 | 89.56 |
| 2020-06-19 | 86.232 | 82.197 | 75.655 | 88.739 |
| 2020-06-18 | 86.727 | 81.792 | 75.296 | 88.288 |
| 2020-06-17 | 86.693 | 81.391 | 75.18 | 87.603 |
| 2020-06-16 | 86.814 | 80.917 | 74.954 | 86.88 |
| 2020-06-15 | 84.572 | 80.46 | 74.993 | 85.926 |
| 2020-06-12 | 83.539 | 80.025 | 74.552 | 85.497 |
| 2020-06-11 | 82.824 | 79.664 | 74.214 | 85.114 |
| 2020-06-10 | 87.001 | 79.316 | 73.828 | 84.803 |
| 2020-06-09 | 84.819 | 78.805 | 74.499 | 83.11 |
| 2020-06-08 | 82.222 | 78.448 | 75.124 | 81.771 |
| 2020-06-05 | 81.739 | 78.16 | 75.219 | 81.101 |
| 2020-06-04 | 79.476 | 77.808 | 74.98 | 80.635 |
| 2020-06-03 | 80.166 | 77.53 | 74.345 | 80.715 |
| 2020-06-02 | 79.727 | 77.18 | 73.707 | 80.654 |
| 2020-06-01 | 79.36 | 76.799 | 72.879 | 80.718 |
| 2020-05-29 | 78.396 | 76.385 | 71.924 | 80.845 |
| 2020-05-28 | 78.472 | 76.077 | 71.373 | 80.782 |
| 2020-05-27 | 78.438 | 75.692 | 70.587 | 80.796 |
| 2020-05-26 | 78.097 | 75.195 | 69.373 | 81.017 |
| 2020-05-22 | 78.63 | 74.772 | 68.634 | 80.91 |
| 2020-05-21 | 78.127 | 74.32 | 68.054 | 80.586 |
| 2020-05-20 | 78.714 | 73.795 | 67.146 | 80.444 |
| 2020-05-19 | 77.212 | 73.254 | 66.534 | 79.974 |
| 2020-05-18 | 77.661 | 72.693 | 65.53 | 79.856 |
| 2020-05-15 | 75.873 | 72.215 | 65.167 | 79.263 |
| 2020-05-14 | 76.324 | 71.898 | 64.968 | 78.829 |
| 2020-05-13 | 75.858 | 71.607 | 64.962 | 78.253 |
| 2020-05-12 | 76.785 | 71.311 | 64.928 | 77.695 |
| 2020-05-11 | 77.673 | 71.002 | 65.13 | 76.873 |
| 2020-05-08 | 76.47 | 70.478 | 65.245 | 75.71 |
| 2020-05-07 | 74.692 | 69.949 | 65.125 | 74.773 |
| 2020-05-06 | 73.927 | 69.486 | 64.796 | 74.176 |
| 2020-05-05 | 73.172 | 68.979 | 64.132 | 73.827 |
| 2020-05-04 | 72.09 | 68.548 | 63.734 | 73.362 |
| 2020-05-01 | 71.085 | 67.912 | 61.919 | 73.904 |
| 2020-04-30 | 72.248 | 67.369 | 60.696 | 74.041 |
| 2020-04-29 | 70.755 | 66.719 | 59.558 | 73.88 |
| 2020-04-28 | 68.505 | 66.307 | 59.176 | 73.439 |
| 2020-04-27 | 69.634 | 66.015 | 58.79 | 73.241 |
| 2020-04-24 | 69.585 | 65.58 | 58.23 | 72.929 |
| 2020-04-23 | 67.632 | 65.278 | 58.118 | 72.438 |
| 2020-04-22 | 67.895 | 64.915 | 57.537 | 72.293 |
| 2020-04-21 | 65.994 | 64.556 | 57.094 | 72.018 |
| 2020-04-20 | 68.099 | 64.015 | 55.547 | 72.483 |
| 2020-04-17 | 69.543 | 63.429 | 54.559 | 72.298 |
| 2020-04-16 | 70.499 | 62.961 | 54.451 | 71.471 |
| 2020-04-15 | 69.944 | 62.469 | 54.65 | 70.288 |
| 2020-04-14 | 70.588 | 62.081 | 55.054 | 69.108 |
| 2020-04-13 | 67.194 | 61.529 | 55.617 | 67.442 |
| 2020-04-09 | 65.901 | 61.588 | 55.435 | 67.74 |
| 2020-04-08 | 65.429 | 61.345 | 55.518 | 67.171 |
| 2020-04-07 | 63.796 | 61.46 | 55.237 | 67.682 |
| 2020-04-06 | 64.543 | 61.778 | 54.54 | 69.016 |
| 2020-04-03 | 59.365 | 61.824 | 54.506 | 69.141 |
| 2020-04-02 | 60.23 | 62.409 | 54.158 | 70.661 |
| 2020-04-01 | 59.242 | 62.999 | 53.82 | 72.179 |
| 2020-03-31 | 62.532 | 63.759 | 53.496 | 74.023 |
| 2020-03-30 | 62.66 | 64.19 | 53.457 | 74.923 |
| 2020-03-27 | 60.921 | 64.731 | 53.294 | 76.169 |
| 2020-03-26 | 63.552 | 65.046 | 53.699 | 76.393 |
| 2020-03-25 | 60.375 | 65.232 | 53.867 | 76.596 |
| 2020-03-24 | 60.71 | 65.811 | 54.315 | 77.307 |
| 2020-03-23 | 55.174 | 66.318 | 54.872 | 77.763 |
| 2020-03-20 | 56.372 | 67.225 | 56.61 | 77.84 |
| 2020-03-19 | 60.193 | 68.256 | 58.062 | 78.449 |
| 2020-03-18 | 60.658 | 69.184 | 58.718 | 79.651 |
| 2020-03-17 | 62.18 | 70.13 | 59.498 | 80.763 |
| 2020-03-16 | 59.561 | 70.944 | 60.38 | 81.507 |
| 2020-03-13 | 68.355 | 71.961 | 62.081 | 81.841 |
| 2020-03-12 | 61.042 | 72.538 | 62.23 | 82.845 |
| 2020-03-11 | 67.73 | 73.509 | 64.096 | 82.921 |
| 2020-03-10 | 70.167 | 74.052 | 64.783 | 83.321 |
| 2020-03-09 | 65.453 | 74.497 | 65.162 | 83.832 |
| 2020-03-06 | 71.075 | 75.159 | 66.641 | 83.678 |
| 2020-03-05 | 72.031 | 75.595 | 67.065 | 84.124 |
| 2020-03-04 | 74.446 | 75.936 | 67.458 | 84.414 |
| 2020-03-03 | 71.146 | 76.125 | 67.62 | 84.63 |
| 2020-03-02 | 73.48 | 76.354 | 68.156 | 84.551 |
| 2020-02-28 | 67.221 | 76.476 | 68.382 | 84.571 |
| 2020-02-27 | 67.261 | 77.088 | 70.112 | 84.064 |
| 2020-02-26 | 71.965 | 77.703 | 72.312 | 83.095 |
| 2020-02-25 | 70.841 | 78.002 | 73.297 | 82.707 |
| 2020-02-24 | 73.325 | 78.249 | 74.698 | 81.801 |
| 2020-02-21 | 76.981 | 78.488 | 75.742 | 81.234 |
| 2020-02-20 | 78.764 | 78.554 | 75.894 | 81.214 |
| 2020-02-19 | 79.581 | 78.513 | 75.842 | 81.184 |
| 2020-02-18 | 78.445 | 78.417 | 75.769 | 81.066 |
| 2020-02-14 | 79.908 | 78.405 | 75.754 | 81.055 |
| 2020-02-13 | 79.888 | 78.276 | 75.681 | 80.871 |
| 2020-02-12 | 80.461 | 78.101 | 75.491 | 80.71 |
| 2020-02-11 | 78.595 | 77.913 | 75.475 | 80.351 |
| 2020-02-10 | 79.072 | 77.871 | 75.453 | 80.289 |
| 2020-02-07 | 78.698 | 77.724 | 75.259 | 80.19 |
| 2020-02-06 | 79.782 | 77.587 | 75.05 | 80.124 |
| 2020-02-05 | 78.86 | 77.317 | 74.627 | 80.008 |
| 2020-02-04 | 78.222 | 77.034 | 73.899 | 80.169 |
| 2020-02-03 | 75.722 | 76.801 | 73.372 | 80.23 |
| 2020-01-31 | 75.931 | 76.663 | 72.87 | 80.456 |
| 2020-01-30 | 79.454 | 76.551 | 72.55 | 80.551 |
| 2020-01-29 | 79.569 | 76.18 | 71.956 | 80.404 |
| 2020-01-28 | 77.938 | 75.777 | 71.391 | 80.164 |
| 2020-01-27 | 75.793 | 75.435 | 70.721 | 80.149 |
| 2020-01-24 | 78.09 | 75.202 | 70.132 | 80.271 |
| 2020-01-23 | 78.315 | 74.784 | 69.371 | 80.197 |
| 2020-01-22 | 77.94 | 74.352 | 68.758 | 79.946 |
| 2020-01-21 | 77.663 | 73.883 | 68.004 | 79.761 |
| 2020-01-17 | 78.193 | 73.434 | 67.411 | 79.457 |
| 2020-01-16 | 77.336 | 72.956 | 67.002 | 78.91 |
| 2020-01-15 | 76.38 | 72.529 | 66.668 | 78.39 |
| 2020-01-14 | 76.708 | 72.143 | 66.33 | 77.956 |
| 2020-01-13 | 77.758 | 71.682 | 65.931 | 77.434 |
| 2020-01-10 | 76.132 | 71.124 | 65.681 | 76.567 |
| 2020-01-09 | 75.96 | 70.639 | 65.34 | 75.938 |
| 2020-01-08 | 74.38 | 70.134 | 65.039 | 75.229 |
| 2020-01-07 | 73.203 | 69.689 | 64.601 | 74.777 |
| 2020-01-06 | 73.549 | 69.35 | 64.339 | 74.36 |
| 2020-01-03 | 72.967 | 68.93 | 63.991 | 73.869 |
| 2020-01-02 | 73.684 | 68.492 | 63.51 | 73.474 |
| 2019-12-31 | 72.04 | 67.991 | 63.183 | 72.798 |
| 2019-12-30 | 71.517 | 67.629 | 63.009 | 72.249 |
| 2019-12-27 | 71.095 | 67.331 | 62.993 | 71.669 |
| 2019-12-26 | 71.122 | 67.062 | 63.034 | 71.089 |
| 2019-12-24 | 69.739 | 66.747 | 63.071 | 70.424 |
| 2019-12-23 | 69.672 | 66.528 | 63.075 | 69.981 |
| 2019-12-20 | 68.554 | 66.255 | 62.982 | 69.529 |
| 2019-12-19 | 68.696 | 66.042 | 62.839 | 69.244 |
| 2019-12-18 | 68.627 | 65.835 | 62.816 | 68.854 |
| 2019-12-17 | 68.792 | 65.67 | 62.932 | 68.408 |
| 2019-12-16 | 68.657 | 65.507 | 63.174 | 67.84 |
| 2019-12-13 | 67.501 | 65.334 | 63.501 | 67.167 |
| 2019-12-12 | 66.596 | 65.18 | 63.603 | 66.758 |
| 2019-12-11 | 66.427 | 65.095 | 63.654 | 66.535 |
| 2019-12-10 | 65.865 | 64.987 | 63.641 | 66.333 |
| 2019-12-09 | 65.482 | 64.91 | 63.598 | 66.222 |
| 2019-12-06 | 66.412 | 64.826 | 63.46 | 66.192 |
| 2019-12-05 | 65.154 | 64.688 | 63.437 | 65.939 |
| 2019-12-04 | 64.212 | 64.576 | 63.128 | 66.025 |
| 2019-12-03 | 63.65 | 64.51 | 62.891 | 66.13 |
| 2019-12-02 | 64.805 | 64.477 | 62.763 | 66.191 |
| 2019-11-29 | 65.563 | 64.365 | 62.47 | 66.26 |
| 2019-11-27 | 65.708 | 64.129 | 61.771 | 66.487 |
| 2019-11-26 | 64.837 | 63.819 | 60.825 | 66.813 |
| 2019-11-25 | 65.347 | 63.552 | 60.061 | 67.044 |
| 2019-11-22 | 64.221 | 63.331 | 59.761 | 66.9 |
| 2019-11-21 | 64.278 | 63.135 | 59.36 | 66.911 |
| 2019-11-20 | 64.567 | 62.9 | 58.863 | 66.938 |
| 2019-11-19 | 65.328 | 62.646 | 58.423 | 66.868 |
| 2019-11-18 | 65.526 | 62.314 | 57.946 | 66.682 |
| 2019-11-15 | 65.198 | 61.979 | 57.621 | 66.338 |
| 2019-11-14 | 64.432 | 61.61 | 57.157 | 66.064 |
| 2019-11-13 | 64.881 | 61.266 | 56.676 | 65.856 |
| 2019-11-12 | 64.266 | 60.888 | 56.307 | 65.47 |
| 2019-11-11 | 64.324 | 60.553 | 56.028 | 65.078 |
| 2019-11-08 | 63.819 | 60.221 | 55.882 | 64.561 |
| 2019-11-07 | 63.645 | 59.919 | 55.787 | 64.051 |
| 2019-11-06 | 62.919 | 59.551 | 55.5 | 63.601 |
| 2019-11-05 | 62.892 | 59.181 | 55.079 | 63.283 |
| 2019-11-04 | 62.982 | 58.781 | 54.643 | 62.919 |
| 2019-11-01 | 62.571 | 58.409 | 54.517 | 62.3 |
| 2019-10-31 | 60.845 | 58.056 | 54.473 | 61.64 |
| 2019-10-30 | 59.499 | 57.715 | 53.96 | 61.469 |
| 2019-10-29 | 59.507 | 57.418 | 53.348 | 61.488 |
| 2019-10-28 | 60.915 | 57.189 | 53.1 | 61.278 |
| 2019-10-25 | 60.311 | 56.882 | 53.045 | 60.719 |
| 2019-10-24 | 59.578 | 56.543 | 52.778 | 60.307 |
| 2019-10-23 | 59.48 | 56.253 | 52.577 | 59.929 |
| 2019-10-22 | 58.692 | 55.982 | 52.504 | 59.46 |
| 2019-10-21 | 58.827 | 55.71 | 52.27 | 59.15 |
| 2019-10-18 | 57.824 | 55.443 | 52.19 | 58.697 |
| 2019-10-17 | 57.547 | 55.215 | 52.021 | 58.409 |
| 2019-10-16 | 57.325 | 55.04 | 51.996 | 58.083 |
| 2019-10-15 | 57.557 | 54.898 | 52.034 | 57.761 |
| 2019-10-14 | 57.692 | 54.719 | 52.106 | 57.331 |
| 2019-10-11 | 57.775 | 54.524 | 52.27 | 56.777 |
| 2019-10-10 | 56.278 | 54.31 | 52.581 | 56.039 |
| 2019-10-09 | 55.53 | 54.224 | 52.741 | 55.707 |
| 2019-10-08 | 54.886 | 54.182 | 52.806 | 55.559 |
| 2019-10-07 | 55.537 | 54.088 | 52.661 | 55.516 |
| 2019-10-04 | 55.525 | 53.931 | 52.482 | 55.38 |
| 2019-10-03 | 54.011 | 53.762 | 52.312 | 55.213 |
| 2019-10-02 | 53.556 | 53.67 | 52.068 | 55.272 |
| 2019-10-01 | 54.933 | 53.551 | 51.611 | 55.49 |
| 2019-09-30 | 54.781 | 53.32 | 51.025 | 55.614 |
| 2019-09-27 | 53.521 | 53.133 | 50.741 | 55.526 |
| 2019-09-26 | 53.783 | 53.013 | 50.475 | 55.552 |
| 2019-09-25 | 54.062 | 52.838 | 50.062 | 55.614 |
| 2019-09-24 | 53.243 | 52.632 | 49.645 | 55.618 |
| 2019-09-23 | 53.497 | 52.495 | 49.384 | 55.605 |
| 2019-09-20 | 53.255 | 52.298 | 48.976 | 55.62 |
| 2019-09-19 | 54.045 | 52.234 | 48.938 | 55.529 |
| 2019-09-18 | 54.488 | 52.132 | 48.942 | 55.321 |
| 2019-09-17 | 53.981 | 51.98 | 48.97 | 54.99 |
| 2019-09-16 | 53.786 | 51.853 | 48.981 | 54.726 |
| 2019-09-13 | 53.504 | 51.69 | 48.904 | 54.476 |
| 2019-09-12 | 54.566 | 51.482 | 48.648 | 54.315 |
| 2019-09-11 | 54.688 | 51.233 | 48.665 | 53.801 |
| 2019-09-10 | 53.003 | 51.054 | 49.034 | 53.074 |
| 2019-09-09 | 52.384 | 50.856 | 48.861 | 52.851 |
| 2019-09-06 | 52.162 | 50.694 | 48.699 | 52.69 |
| 2019-09-05 | 52.166 | 50.565 | 48.631 | 52.499 |
| 2019-09-04 | 51.166 | 50.381 | 48.395 | 52.368 |
| 2019-09-03 | 50.312 | 50.223 | 48.02 | 52.427 |
| 2019-08-30 | 51.056 | 50.063 | 47.477 | 52.649 |
| 2019-08-29 | 51.122 | 49.996 | 47.447 | 52.545 |
| 2019-08-28 | 50.271 | 49.979 | 47.456 | 52.503 |
| 2019-08-27 | 49.936 | 50.061 | 47.402 | 52.72 |
| 2019-08-26 | 50.506 | 50.108 | 47.427 | 52.789 |
| 2019-08-23 | 49.564 | 50.137 | 47.427 | 52.848 |
| 2019-08-22 | 51.966 | 50.19 | 47.485 | 52.895 |
| 2019-08-21 | 52.01 | 50.114 | 47.53 | 52.698 |
| 2019-08-20 | 51.452 | 50.056 | 47.596 | 52.516 |
| 2019-08-19 | 51.45 | 50.028 | 47.62 | 52.435 |
| 2019-08-16 | 50.508 | 49.98 | 47.65 | 52.309 |
| 2019-08-15 | 49.344 | 49.923 | 47.592 | 52.253 |
| 2019-08-14 | 49.591 | 49.961 | 47.644 | 52.278 |
| 2019-08-13 | 51.112 | 49.959 | 47.641 | 52.277 |
| 2019-08-12 | 49.036 | 49.895 | 47.638 | 52.152 |
| 2019-08-09 | 49.16 | 49.943 | 47.72 | 52.166 |
| 2019-08-08 | 49.569 | 49.962 | 47.76 | 52.164 |
| 2019-08-07 | 48.499 | 49.941 | 47.718 | 52.165 |
| 2019-08-06 | 48.002 | 49.992 | 47.858 | 52.127 |
| 2019-08-05 | 47.11 | 50.044 | 48.061 | 52.028 |
| 2019-08-02 | 49.713 | 50.126 | 48.536 | 51.715 |
| 2019-08-01 | 50.787 | 50.128 | 48.541 | 51.715 |
| 2019-07-31 | 51.911 | 50.079 | 48.516 | 51.642 |
| 2019-07-30 | 50.872 | 49.954 | 48.611 | 51.296 |
| 2019-07-29 | 51.092 | 49.865 | 48.545 | 51.186 |
| 2019-07-26 | 50.619 | 49.722 | 48.344 | 51.1 |
| 2019-07-25 | 50.444 | 49.625 | 48.238 | 51.011 |
| 2019-07-24 | 50.846 | 49.537 | 48.146 | 50.927 |
| 2019-07-23 | 50.887 | 49.377 | 47.895 | 50.86 |
| 2019-07-22 | 50.492 | 49.252 | 47.883 | 50.622 |
| 2019-07-19 | 49.364 | 49.149 | 47.861 | 50.437 |
| 2019-07-18 | 50.112 | 49.111 | 47.806 | 50.416 |
| 2019-07-17 | 49.549 | 49.016 | 47.74 | 50.292 |
| 2019-07-16 | 49.83 | 48.957 | 47.674 | 50.239 |
| 2019-07-15 | 50.003 | 48.827 | 47.409 | 50.246 |
| 2019-07-12 | 49.537 | 48.675 | 47.147 | 50.204 |
| 2019-07-11 | 49.16 | 48.564 | 46.979 | 50.149 |
| 2019-07-10 | 49.52 | 48.472 | 46.823 | 50.121 |
| 2019-07-09 | 49.035 | 48.369 | 46.739 | 50 |
| 2019-07-08 | 48.738 | 48.264 | 46.548 | 49.979 |
| 2019-07-05 | 49.764 | 48.143 | 46.25 | 50.037 |
| 2019-07-03 | 49.808 | 47.912 | 45.753 | 50.07 |
| 2019-07-02 | 49.398 | 47.645 | 45.193 | 50.098 |
| 2019-07-01 | 49.111 | 47.364 | 44.521 | 50.207 |
| 2019-06-28 | 48.226 | 47.02 | 43.516 | 50.524 |
| 2019-06-27 | 48.67 | 46.742 | 42.807 | 50.676 |
| 2019-06-26 | 48.684 | 46.48 | 42.402 | 50.559 |
| 2019-06-25 | 47.654 | 46.207 | 42.025 | 50.389 |
| 2019-06-24 | 48.387 | 45.996 | 41.702 | 50.29 |
| 2019-06-21 | 48.436 | 45.757 | 41.49 | 50.024 |
| 2019-06-20 | 48.602 | 45.524 | 41.36 | 49.688 |
| 2019-06-19 | 48.214 | 45.321 | 41.387 | 49.254 |
| 2019-06-18 | 48.355 | 45.184 | 41.479 | 48.888 |
| 2019-06-17 | 47.244 | 44.996 | 41.585 | 48.408 |
| 2019-06-14 | 46.964 | 44.937 | 41.645 | 48.229 |
| 2019-06-13 | 47.308 | 44.904 | 41.681 | 48.128 |
| 2019-06-12 | 47.317 | 44.865 | 41.742 | 47.988 |
| 2019-06-11 | 47.468 | 44.798 | 41.835 | 47.76 |
| 2019-06-10 | 46.925 | 44.687 | 41.977 | 47.397 |
| 2019-06-07 | 46.333 | 44.743 | 41.813 | 47.673 |
| 2019-06-06 | 45.132 | 44.862 | 41.518 | 48.207 |
| 2019-06-05 | 44.479 | 45.068 | 41.214 | 48.922 |
| 2019-06-04 | 43.772 | 45.306 | 41.059 | 49.553 |
| 2019-06-03 | 42.227 | 45.648 | 40.882 | 50.414 |
| 2019-05-31 | 42.659 | 46.107 | 40.993 | 51.22 |
| 2019-05-30 | 43.446 | 46.512 | 41.272 | 51.752 |
| 2019-05-29 | 43.221 | 46.895 | 41.491 | 52.298 |
| 2019-05-28 | 43.429 | 47.169 | 41.987 | 52.351 |
| 2019-05-24 | 43.609 | 47.481 | 42.489 | 52.472 |
| 2019-05-23 | 43.777 | 47.78 | 43.042 | 52.518 |
| 2019-05-22 | 44.537 | 48.082 | 43.642 | 52.523 |
| 2019-05-21 | 45.468 | 48.37 | 44.146 | 52.594 |
| 2019-05-20 | 44.613 | 48.615 | 44.526 | 52.703 |
| 2019-05-17 | 46.053 | 48.866 | 45.196 | 52.536 |
| 2019-05-16 | 46.316 | 49.038 | 45.596 | 52.479 |
| 2019-05-15 | 46.521 | 49.187 | 45.98 | 52.395 |
| 2019-05-14 | 45.97 | 49.279 | 46.285 | 52.274 |
| 2019-05-13 | 45.254 | 49.399 | 46.774 | 52.023 |
| 2019-05-10 | 48.046 | 49.55 | 47.648 | 51.451 |
| 2019-05-09 | 48.721 | 49.562 | 47.697 | 51.427 |
| 2019-05-08 | 49.25 | 49.561 | 47.693 | 51.428 |
| 2019-05-07 | 49.24 | 49.52 | 47.591 | 51.448 |
| 2019-05-06 | 50.605 | 49.486 | 47.516 | 51.456 |
| 2019-05-03 | 51.398 | 49.347 | 47.32 | 51.373 |
| 2019-05-02 | 50.767 | 49.152 | 47.203 | 51.1 |
| 2019-05-01 | 51.1 | 48.984 | 47.044 | 50.924 |
| 2019-04-30 | 48.709 | 48.784 | 46.934 | 50.634 |
| 2019-04-29 | 49.665 | 48.67 | 46.551 | 50.788 |
| 2019-04-26 | 49.59 | 48.492 | 46.152 | 50.832 |
| 2019-04-25 | 49.828 | 48.303 | 45.747 | 50.858 |
| 2019-04-24 | 50.284 | 48.099 | 45.414 | 50.783 |
| 2019-04-23 | 50.362 | 47.851 | 45.108 | 50.595 |
| 2019-04-22 | 49.646 | 47.624 | 44.999 | 50.249 |
| 2019-04-18 | 49.483 | 47.46 | 44.954 | 49.966 |
| 2019-04-17 | 49.306 | 47.354 | 45.026 | 49.682 |
| 2019-04-16 | 48.364 | 47.172 | 44.916 | 49.428 |
| 2019-04-15 | 48.359 | 47.018 | 44.688 | 49.348 |
| 2019-04-12 | 48.272 | 46.882 | 44.563 | 49.2 |
| 2019-04-11 | 48.291 | 46.727 | 44.387 | 49.067 |
| 2019-04-10 | 48.697 | 46.542 | 44.143 | 48.941 |
| 2019-04-09 | 48.425 | 46.313 | 43.904 | 48.722 |
| 2019-04-08 | 48.57 | 46.087 | 43.666 | 48.508 |
| 2019-04-05 | 47.818 | 45.83 | 43.426 | 48.234 |
| 2019-04-04 | 47.5 | 45.538 | 42.776 | 48.299 |
| 2019-04-03 | 47.417 | 45.256 | 42.218 | 48.294 |
| 2019-04-02 | 47.095 | 45.003 | 41.887 | 48.12 |
| 2019-04-01 | 46.42 | 44.779 | 41.651 | 47.907 |
| 2019-03-29 | 46.107 | 44.592 | 41.432 | 47.752 |
| 2019-03-28 | 45.808 | 44.41 | 41.202 | 47.619 |
| 2019-03-27 | 45.747 | 44.221 | 40.92 | 47.522 |
| 2019-03-26 | 45.34 | 44.056 | 40.747 | 47.365 |
| 2019-03-25 | 45.813 | 43.905 | 40.568 | 47.242 |
| 2019-03-22 | 46.374 | 43.729 | 40.442 | 47.016 |
| 2019-03-21 | 47.354 | 43.509 | 40.376 | 46.643 |
| 2019-03-20 | 45.672 | 43.218 | 40.513 | 45.923 |
| 2019-03-19 | 45.277 | 43.022 | 40.495 | 45.549 |
| 2019-03-18 | 45.638 | 42.833 | 40.447 | 45.219 |
| 2019-03-15 | 45.177 | 42.619 | 40.529 | 44.709 |
| 2019-03-14 | 44.597 | 42.433 | 40.647 | 44.219 |
| 2019-03-13 | 44.107 | 42.269 | 40.72 | 43.817 |
| 2019-03-12 | 43.912 | 42.137 | 40.804 | 43.471 |
| 2019-03-11 | 43.425 | 41.998 | 40.869 | 43.127 |
| 2019-03-08 | 41.971 | 41.895 | 40.943 | 42.847 |
| 2019-03-07 | 41.871 | 41.862 | 40.878 | 42.846 |
| 2019-03-06 | 42.361 | 41.874 | 40.884 | 42.864 |
| 2019-03-05 | 42.607 | 41.861 | 40.891 | 42.832 |
| 2019-03-04 | 42.684 | 41.8 | 40.873 | 42.728 |
| 2019-03-01 | 42.471 | 41.679 | 40.617 | 42.74 |
| 2019-02-28 | 42.029 | 41.566 | 40.395 | 42.738 |
| 2019-02-27 | 42.446 | 41.462 | 40.115 | 42.809 |
| 2019-02-26 | 42.315 | 41.209 | 39.043 | 43.374 |
| 2019-02-25 | 42.291 | 40.982 | 38.414 | 43.55 |
| 2019-02-22 | 41.985 | 40.774 | 37.998 | 43.55 |
| 2019-02-21 | 41.522 | 40.52 | 37.335 | 43.705 |
| 2019-02-20 | 41.757 | 40.304 | 36.846 | 43.762 |
| 2019-02-19 | 41.49 | 40.069 | 36.404 | 43.734 |
| 2019-02-15 | 41.366 | 39.889 | 36.169 | 43.609 |
| 2019-02-14 | 41.458 | 39.705 | 35.93 | 43.48 |
| 2019-02-13 | 41.308 | 39.504 | 35.697 | 43.311 |
| 2019-02-12 | 41.48 | 39.288 | 35.427 | 43.15 |
| 2019-02-11 | 41.126 | 39.027 | 35.087 | 42.967 |
| 2019-02-08 | 41.364 | 38.811 | 34.882 | 42.741 |
| 2019-02-07 | 41.315 | 38.602 | 34.794 | 42.409 |
| 2019-02-06 | 42.113 | 38.389 | 34.739 | 42.039 |
| 2019-02-05 | 42.098 | 38.105 | 34.79 | 41.42 |
| 2019-02-04 | 41.39 | 37.788 | 34.872 | 40.704 |
| 2019-02-01 | 40.247 | 37.51 | 34.987 | 40.032 |
| 2019-01-31 | 40.228 | 37.216 | 34.667 | 39.764 |
| 2019-01-30 | 39.94 | 37.113 | 34.918 | 39.308 |
| 2019-01-29 | 37.385 | 37.022 | 35.18 | 38.864 |
| 2019-01-28 | 37.777 | 37.041 | 35.177 | 38.904 |
| 2019-01-25 | 38.13 | 37.039 | 35.178 | 38.9 |
| 2019-01-24 | 36.907 | 37.032 | 35.187 | 38.877 |
| 2019-01-23 | 37.202 | 36.961 | 34.997 | 38.925 |
| 2019-01-22 | 37.052 | 36.922 | 34.948 | 38.896 |
| 2019-01-18 | 37.902 | 36.965 | 34.945 | 38.985 |
| 2019-01-17 | 37.67 | 37.014 | 34.862 | 39.166 |
| 2019-01-16 | 37.448 | 37.138 | 34.601 | 39.675 |
| 2019-01-15 | 36.996 | 37.246 | 34.488 | 40.004 |
| 2019-01-14 | 36.254 | 37.396 | 34.394 | 40.399 |
| 2019-01-11 | 36.808 | 37.649 | 34.248 | 41.051 |
| 2019-01-10 | 37.173 | 37.853 | 34.2 | 41.505 |
| 2019-01-09 | 37.054 | 38.032 | 34.184 | 41.88 |
| 2019-01-08 | 36.435 | 38.229 | 34.202 | 42.255 |
| 2019-01-07 | 35.754 | 38.443 | 34.365 | 42.521 |
| 2019-01-04 | 35.834 | 38.767 | 34.568 | 42.966 |
| 2019-01-03 | 34.367 | 39.11 | 34.805 | 43.416 |
| 2019-01-02 | 38.168 | 39.626 | 35.248 | 44.003 |
| 2018-12-31 | 38.125 | 39.875 | 35.294 | 44.456 |
| 2018-12-28 | 37.76 | 40.139 | 35.387 | 44.89 |
| 2018-12-27 | 37.741 | 40.437 | 35.572 | 45.302 |
| 2018-12-26 | 37.987 | 40.656 | 35.904 | 45.408 |
| 2018-12-24 | 35.488 | 40.867 | 36.234 | 45.5 |
| 2018-12-21 | 36.431 | 41.175 | 37.248 | 45.101 |
| 2018-12-20 | 37.905 | 41.489 | 38.173 | 44.806 |
| 2018-12-19 | 38.886 | 41.733 | 38.813 | 44.653 |
| 2018-12-18 | 40.138 | 42.035 | 39.107 | 44.963 |
| 2018-12-17 | 39.623 | 42.366 | 38.916 | 45.817 |
| 2018-12-14 | 39.996 | 42.698 | 39.093 | 46.304 |
| 2018-12-13 | 41.318 | 42.956 | 39.424 | 46.488 |
| 2018-12-12 | 40.87 | 43.213 | 39.455 | 46.972 |
| 2018-12-11 | 40.757 | 43.516 | 39.589 | 47.444 |
| 2018-12-10 | 40.991 | 43.949 | 39.464 | 48.435 |
| 2018-12-07 | 40.723 | 44.419 | 39.341 | 49.497 |
| 2018-12-06 | 42.229 | 44.911 | 39.467 | 50.356 |
| 2018-12-04 | 42.705 | 45.254 | 39.667 | 50.841 |
| 2018-12-03 | 44.67 | 45.546 | 39.912 | 51.181 |
| 2018-11-30 | 43.162 | 45.812 | 39.876 | 51.747 |
| 2018-11-29 | 43.396 | 46.33 | 39.648 | 53.011 |
| 2018-11-28 | 43.732 | 46.795 | 39.71 | 53.881 |
| 2018-11-27 | 42.113 | 47.178 | 39.971 | 54.384 |
| 2018-11-26 | 42.205 | 47.628 | 40.621 | 54.635 |
| 2018-11-23 | 41.641 | 48.122 | 41.323 | 54.922 |
| 2018-11-21 | 42.727 | 48.687 | 42.269 | 55.106 |
| 2018-11-20 | 42.775 | 49.141 | 43.207 | 55.075 |
| 2018-11-19 | 44.921 | 49.685 | 44.209 | 55.16 |
| 2018-11-16 | 46.775 | 50.096 | 44.884 | 55.308 |
| 2018-11-15 | 46.263 | 50.398 | 45.292 | 55.505 |
| 2018-11-14 | 45.148 | 50.687 | 45.906 | 55.467 |
| 2018-11-13 | 46.461 | 51.093 | 46.922 | 55.264 |
| 2018-11-12 | 46.93 | 51.445 | 47.733 | 55.157 |
| 2018-11-09 | 49.419 | 51.716 | 48.623 | 54.81 |
| 2018-11-08 | 50.391 | 51.92 | 48.923 | 54.917 |
| 2018-11-07 | 50.567 | 51.983 | 49.066 | 54.901 |
| 2018-11-06 | 49.079 | 52.06 | 49.216 | 54.905 |
| 2018-11-05 | 48.554 | 52.338 | 49.63 | 55.047 |
| 2018-11-02 | 49.972 | 52.606 | 50.444 | 54.767 |
| 2018-11-01 | 53.523 | 52.808 | 50.931 | 54.685 |
| 2018-10-31 | 52.713 | 52.878 | 50.807 | 54.948 |
| 2018-10-30 | 51.374 | 53.037 | 50.587 | 55.486 |
| 2018-10-29 | 51.119 | 53.229 | 50.728 | 55.73 |
| 2018-10-26 | 52.097 | 53.41 | 51.025 | 55.795 |
| 2018-10-25 | 52.94 | 53.524 | 51.183 | 55.864 |
| 2018-10-24 | 51.805 | 53.586 | 51.245 | 55.926 |
| 2018-10-23 | 53.645 | 53.65 | 51.441 | 55.858 |
| 2018-10-22 | 53.144 | 53.643 | 51.434 | 55.853 |
| 2018-10-19 | 52.822 | 53.645 | 51.437 | 55.853 |
| 2018-10-18 | 52.029 | 53.625 | 51.381 | 55.869 |
| 2018-10-17 | 53.274 | 53.673 | 51.53 | 55.817 |
| 2018-10-16 | 53.506 | 53.639 | 51.45 | 55.829 |
| 2018-10-15 | 52.352 | 53.592 | 51.354 | 55.831 |
| 2018-10-12 | 53.496 | 53.599 | 51.373 | 55.824 |
| 2018-10-11 | 51.651 | 53.619 | 51.391 | 55.848 |
| 2018-10-10 | 52.111 | 53.764 | 51.696 | 55.831 |
| 2018-10-09 | 54.643 | 53.82 | 51.878 | 55.762 |
| 2018-10-08 | 53.896 | 53.784 | 51.878 | 55.69 |
| 2018-10-05 | 54.021 | 53.718 | 51.744 | 55.693 |
| 2018-10-04 | 54.912 | 53.682 | 51.705 | 55.66 |
| 2018-10-03 | 55.895 | 53.623 | 51.727 | 55.52 |
| 2018-10-02 | 55.223 | 53.561 | 51.901 | 55.221 |
| 2018-10-01 | 54.736 | 53.55 | 51.932 | 55.168 |
| 2018-09-28 | 54.37 | 53.554 | 51.923 | 55.186 |
| 2018-09-27 | 54.18 | 53.546 | 51.93 | 55.162 |
| 2018-09-26 | 53.089 | 53.522 | 51.93 | 55.114 |
| 2018-09-25 | 53.515 | 53.513 | 51.91 | 55.116 |
| 2018-09-24 | 53.178 | 53.462 | 51.799 | 55.126 |
| 2018-09-21 | 52.424 | 53.406 | 51.637 | 55.176 |
| 2018-09-20 | 52.995 | 53.38 | 51.54 | 55.221 |
| 2018-09-19 | 52.595 | 53.32 | 51.359 | 55.281 |
| 2018-09-18 | 52.564 | 53.28 | 51.231 | 55.33 |
| 2018-09-17 | 52.477 | 53.247 | 51.131 | 55.363 |
| 2018-09-14 | 53.913 | 53.243 | 51.122 | 55.364 |
| 2018-09-13 | 54.532 | 53.116 | 50.871 | 55.362 |
| 2018-09-12 | 53.246 | 52.922 | 50.53 | 55.313 |
| 2018-09-11 | 53.915 | 52.785 | 50.182 | 55.389 |
| 2018-09-10 | 52.586 | 52.605 | 49.844 | 55.365 |
| 2018-09-07 | 53.301 | 52.475 | 49.487 | 55.462 |
| 2018-09-06 | 53.734 | 52.316 | 49.188 | 55.445 |
| 2018-09-05 | 54.643 | 52.117 | 48.869 | 55.365 |
| 2018-09-04 | 55.001 | 51.87 | 48.678 | 55.062 |
| 2018-08-31 | 54.826 | 51.629 | 48.702 | 54.556 |
| 2018-08-30 | 54.199 | 51.384 | 48.763 | 54.004 |
| 2018-08-29 | 53.706 | 51.163 | 48.795 | 53.53 |
| 2018-08-28 | 52.916 | 50.895 | 48.53 | 53.26 |
| 2018-08-27 | 52.492 | 50.533 | 47.417 | 53.649 |
| 2018-08-24 | 52.063 | 50.188 | 46.531 | 53.844 |
| 2018-08-23 | 51.902 | 49.876 | 45.868 | 53.885 |
| 2018-08-22 | 51.796 | 49.612 | 45.477 | 53.747 |
| 2018-08-21 | 51.793 | 49.36 | 45.175 | 53.545 |
| 2018-08-20 | 51.894 | 49.087 | 44.858 | 53.315 |
| 2018-08-17 | 52.405 | 48.791 | 44.564 | 53.019 |
| 2018-08-16 | 51.379 | 48.469 | 44.411 | 52.526 |
| 2018-08-15 | 50.637 | 48.202 | 44.246 | 52.158 |
| 2018-08-14 | 50.519 | 47.955 | 44.022 | 51.889 |
| 2018-08-13 | 50.307 | 47.727 | 43.886 | 51.568 |
| 2018-08-10 | 49.984 | 47.503 | 43.768 | 51.237 |